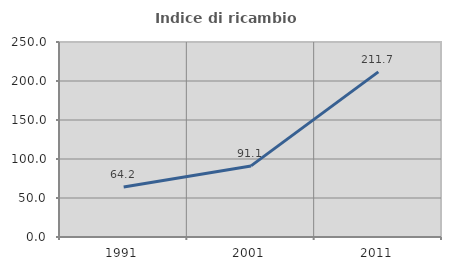
| Category | Indice di ricambio occupazionale  |
|---|---|
| 1991.0 | 64.208 |
| 2001.0 | 91.135 |
| 2011.0 | 211.688 |